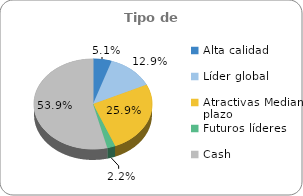
| Category | Series 0 |
|---|---|
| Alta calidad | 0.051 |
| Líder global | 0.129 |
| Atractivas Mediano plazo | 0.259 |
| Futuros líderes | 0.022 |
| Cash | 0.539 |